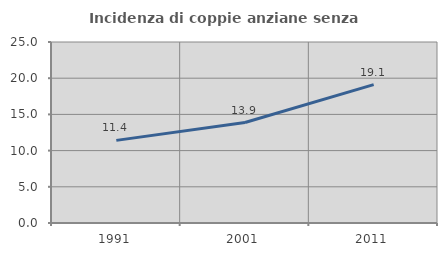
| Category | Incidenza di coppie anziane senza figli  |
|---|---|
| 1991.0 | 11.411 |
| 2001.0 | 13.878 |
| 2011.0 | 19.113 |